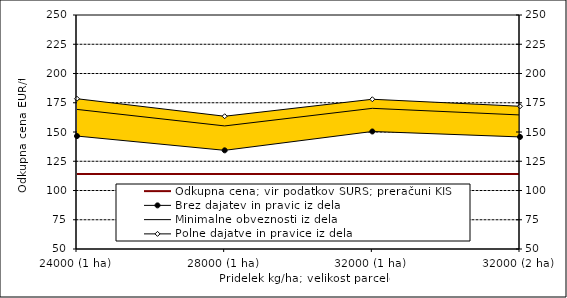
| Category | Odkupna cena; vir podatkov SURS; preračuni KIS |
|---|---|
| 24000 (1 ha) | 114 |
| 28000 (1 ha) | 114 |
| 32000 (1 ha) | 114 |
| 32000 (2 ha) | 114 |